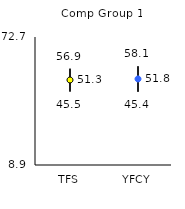
| Category | 25th | 75th | Mean |
|---|---|---|---|
| TFS | 45.5 | 56.9 | 51.27 |
| YFCY | 45.4 | 58.1 | 51.79 |